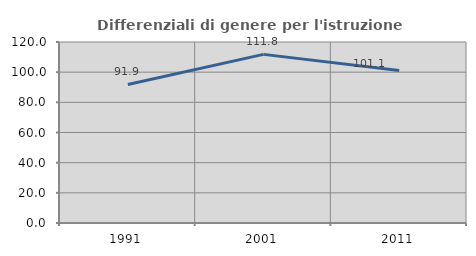
| Category | Differenziali di genere per l'istruzione superiore |
|---|---|
| 1991.0 | 91.859 |
| 2001.0 | 111.798 |
| 2011.0 | 101.091 |